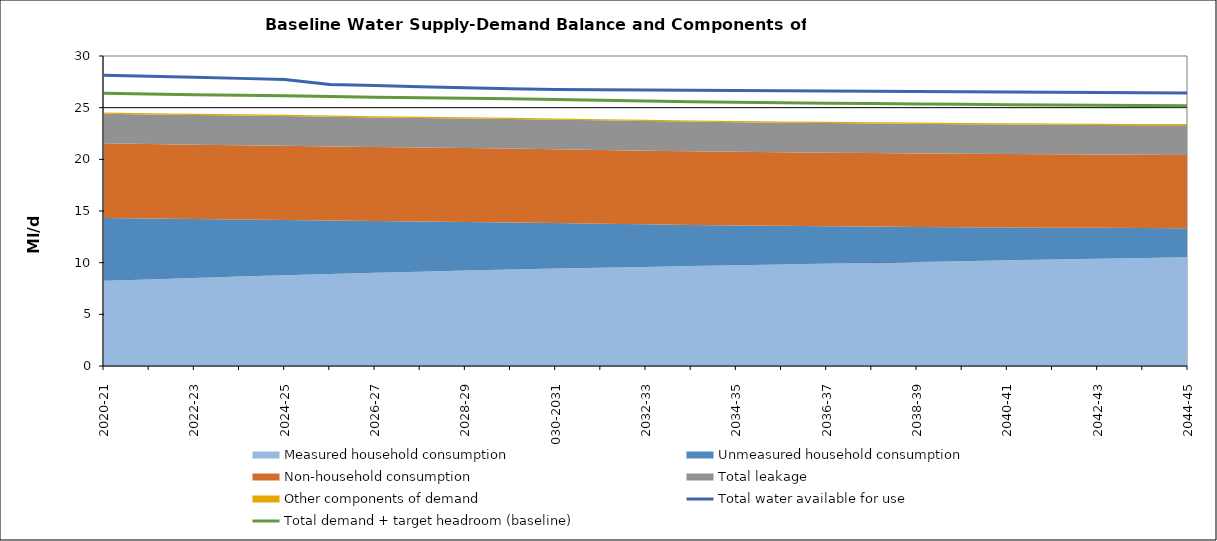
| Category | Total water available for use | Total demand + target headroom (baseline) |
|---|---|---|
| 0 | 28.135 | 26.391 |
| 1 | 28.035 | 26.32 |
| 2 | 27.935 | 26.257 |
| 3 | 27.835 | 26.198 |
| 4 | 27.735 | 26.148 |
| 5 | 27.235 | 26.077 |
| 6 | 27.135 | 26.013 |
| 7 | 27.035 | 25.957 |
| 8 | 26.935 | 25.905 |
| 9 | 26.835 | 25.859 |
| 10 | 26.76 | 25.783 |
| 11 | 26.735 | 25.713 |
| 12 | 26.71 | 25.648 |
| 13 | 26.685 | 25.584 |
| 14 | 26.66 | 25.526 |
| 15 | 26.635 | 25.478 |
| 16 | 26.61 | 25.434 |
| 17 | 26.585 | 25.394 |
| 18 | 26.56 | 25.354 |
| 19 | 26.535 | 25.319 |
| 20 | 26.51 | 25.285 |
| 21 | 26.485 | 25.258 |
| 22 | 26.46 | 25.237 |
| 23 | 26.435 | 25.212 |
| 24 | 26.41 | 25.19 |